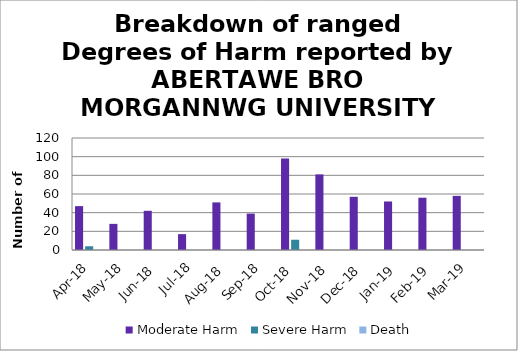
| Category | Moderate Harm | Severe Harm | Death |
|---|---|---|---|
| Apr-18 | 47 | 4 | 0 |
| May-18 | 28 | 0 | 0 |
| Jun-18 | 42 | 0 | 0 |
| Jul-18 | 17 | 0 | 0 |
| Aug-18 | 51 | 0 | 0 |
| Sep-18 | 39 | 0 | 0 |
| Oct-18 | 98 | 11 | 0 |
| Nov-18 | 81 | 0 | 0 |
| Dec-18 | 57 | 0 | 0 |
| Jan-19 | 52 | 0 | 0 |
| Feb-19 | 56 | 0 | 0 |
| Mar-19 | 58 | 0 | 0 |